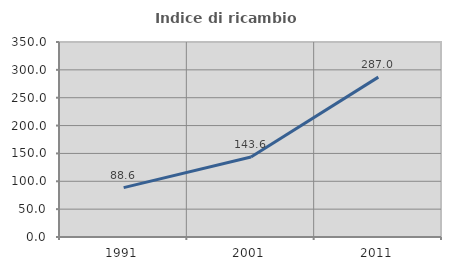
| Category | Indice di ricambio occupazionale  |
|---|---|
| 1991.0 | 88.636 |
| 2001.0 | 143.624 |
| 2011.0 | 286.957 |